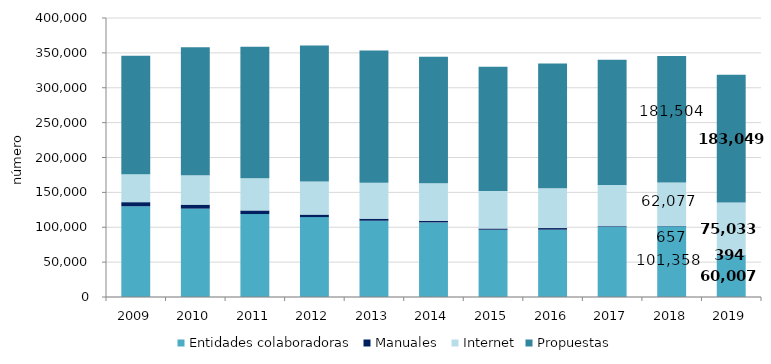
| Category | Entidades colaboradoras | Manuales  | Internet | Propuestas |
|---|---|---|---|---|
| 2009.0 | 130077 | 5880 | 40173 | 169670 |
| 2010.0 | 126722 | 5687 | 42319 | 183242 |
| 2011.0 | 118944 | 5162 | 46264 | 188235 |
| 2012.0 | 114561 | 3580 | 47321 | 195282 |
| 2013.0 | 109332 | 3012 | 51592 | 189526 |
| 2014.0 | 106945 | 2347 | 53742 | 181366 |
| 2015.0 | 96432 | 1819 | 53598 | 178257 |
| 2016.0 | 96513 | 2276 | 57092 | 179060 |
| 2017.0 | 100458 | 1082 | 59112 | 179414 |
| 2018.0 | 101358 | 657 | 62077 | 181504 |
| 2019.0 | 60007 | 394 | 75033 | 183049 |